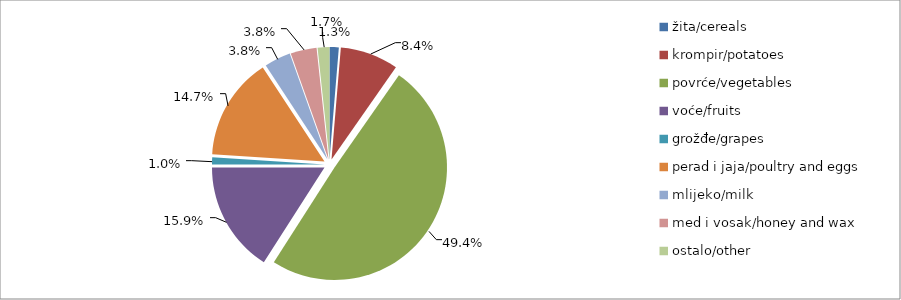
| Category | Series 0 |
|---|---|
| žita/cereals | 15602.5 |
| krompir/potatoes | 98595 |
| povrće/vegetables | 580806 |
| voće/fruits | 187653.5 |
| grožđe/grapes | 11808 |
| perad i jaja/poultry and eggs | 173450 |
| mlijeko/milk | 44684.5 |
| med i vosak/honey and wax | 44166 |
| ostalo/other | 19930 |